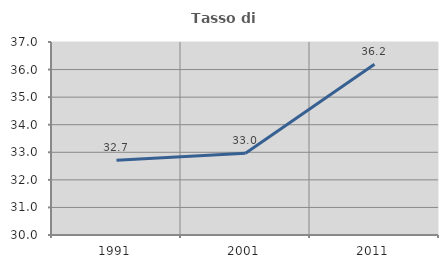
| Category | Tasso di occupazione   |
|---|---|
| 1991.0 | 32.71 |
| 2001.0 | 32.963 |
| 2011.0 | 36.191 |